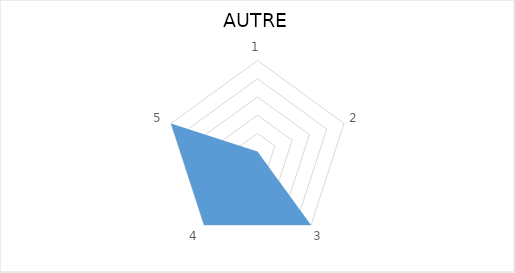
| Category | Series 0 |
|---|---|
| 0 | 0 |
| 1 | 0 |
| 2 | 1 |
| 3 | 1 |
| 4 | 1 |